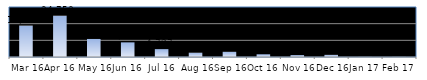
| Category | Series 0 |
|---|---|
| Mar 16 | 18825 |
| Apr 16 | 24753 |
| May 16 | 10821 |
| Jun 16 | 8788 |
| Jul 16 | 4727 |
| Aug 16 | 2557 |
| Sep 16 | 3103 |
| Oct 16 | 1638 |
| Nov 16 | 1141 |
| Dec 16 | 1279 |
| Jan 17 | 47 |
| Feb 17 | 56 |